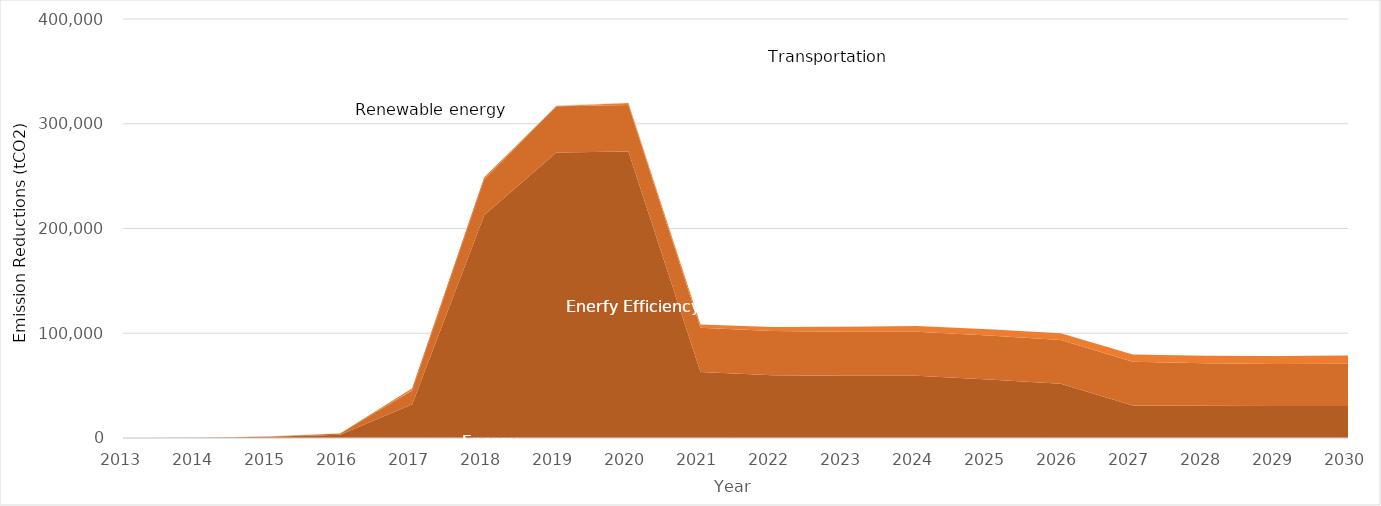
| Category | Energy efficiency | Renewable energy | Waste management & biomass utilisation | Transportation |
|---|---|---|---|---|
| 0 | 0 | 0 | 0 | 0 |
| 1 | 127 | 36 | 0 | 0 |
| 2 | 1239 | 259 | 0 | 134 |
| 3 | 3122 | 1158 | 0 | 324 |
| 4 | 32181 | 15180 | -1933 | 324 |
| 5 | 212864 | 35822 | -1853 | 324 |
| 6 | 272485 | 44250 | 262 | 324 |
| 7 | 273506 | 44439 | 1833 | 324 |
| 8 | 63008 | 42204 | 3030 | 0 |
| 9 | 59892 | 42201 | 3970 | 0 |
| 10 | 59318 | 42198 | 4728 | 0 |
| 11 | 59335 | 42195 | 5359 | 0 |
| 12 | 55772 | 42068 | 5897 | 0 |
| 13 | 51679 | 41964 | 6367 | 0 |
| 14 | 31108 | 41781 | 6785 | 0 |
| 15 | 30866 | 40404 | 7163 | 0 |
| 16 | 30431 | 40306 | 7509 | 0 |
| 17 | 30525 | 40306 | 7829 | 0 |